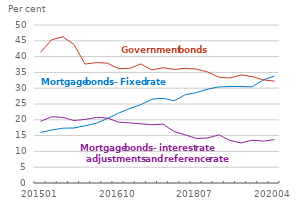
| Category | Mortgage bonds - Fixed | Mortgage bonds - RTL and reference rate | Government bonds |
|---|---|---|---|
| 201501 | 16.007 | 19.528 | 41.391 |
| 201504 | 16.747 | 20.962 | 45.34 |
| 201507 | 17.35 | 20.763 | 46.261 |
| 201510 | 17.403 | 19.774 | 43.835 |
| 201601 | 18.126 | 20.118 | 37.619 |
| 201604 | 18.898 | 20.741 | 38.12 |
| 201607 | 20.399 | 20.562 | 37.915 |
| 201610 | 22.101 | 19.266 | 36.213 |
| 201701 | 23.554 | 19.026 | 36.285 |
| 201704 | 24.772 | 18.725 | 37.676 |
| 201707 | 26.524 | 18.442 | 35.767 |
| 201710 | 26.829 | 18.608 | 36.474 |
| 201801 | 26.009 | 16.277 | 35.934 |
| 201804 | 27.955 | 15.224 | 36.289 |
| 201807 | 28.617 | 14.106 | 36.03 |
| 201810 | 29.697 | 14.243 | 35.132 |
| 201901 | 30.406 | 15.233 | 33.5 |
| 201904 | 30.53 | 13.487 | 33.225 |
| 201907 | 30.531 | 12.683 | 34.209 |
| 201910 | 30.442 | 13.522 | 33.675 |
| 202001 | 32.601 | 13.252 | 32.63 |
| 202004 | 33.881 | 13.754 | 32.249 |